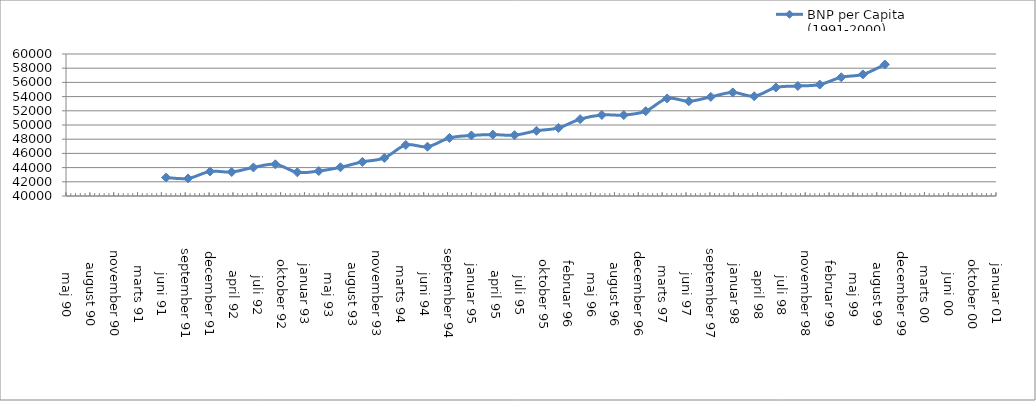
| Category | BNP per Capita (1991-2000) |
|---|---|
| 33420.0 | 42601 |
| 33512.0 | 42474 |
| 33604.0 | 43457 |
| 33695.0 | 43379 |
| 33786.0 | 44021 |
| 33878.0 | 44463 |
| 33970.0 | 43338 |
| 34060.0 | 43513 |
| 34151.0 | 44047 |
| 34243.0 | 44808 |
| 34335.0 | 45360 |
| 34425.0 | 47191 |
| 34516.0 | 46938 |
| 34608.0 | 48178 |
| 34700.0 | 48530 |
| 34790.0 | 48645 |
| 34881.0 | 48567 |
| 34973.0 | 49184 |
| 35065.0 | 49589 |
| 35156.0 | 50826 |
| 35247.0 | 51415 |
| 35339.0 | 51397 |
| 35431.0 | 51946 |
| 35521.0 | 53742 |
| 35612.0 | 53343 |
| 35704.0 | 53957 |
| 35796.0 | 54590 |
| 35886.0 | 54053 |
| 35977.0 | 55283 |
| 36069.0 | 55489 |
| 36161.0 | 55695 |
| 36251.0 | 56724 |
| 36342.0 | 57131 |
| 36434.0 | 58521 |